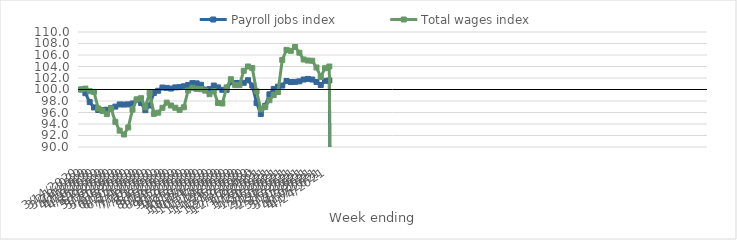
| Category | Payroll jobs index | Total wages index |
|---|---|---|
| 14/03/2020 | 100 | 100 |
| 21/03/2020 | 99.358 | 100.153 |
| 28/03/2020 | 97.811 | 99.701 |
| 04/04/2020 | 96.882 | 99.581 |
| 11/04/2020 | 96.433 | 96.708 |
| 18/04/2020 | 96.395 | 96.267 |
| 25/04/2020 | 96.489 | 95.714 |
| 02/05/2020 | 96.74 | 96.68 |
| 09/05/2020 | 97.022 | 94.374 |
| 16/05/2020 | 97.402 | 92.846 |
| 23/05/2020 | 97.386 | 92.178 |
| 30/05/2020 | 97.412 | 93.398 |
| 06/06/2020 | 97.56 | 96.486 |
| 13/06/2020 | 98.225 | 98.282 |
| 20/06/2020 | 97.658 | 98.485 |
| 27/06/2020 | 96.4 | 96.932 |
| 04/07/2020 | 97.215 | 99.382 |
| 11/07/2020 | 99.401 | 95.766 |
| 18/07/2020 | 99.781 | 95.965 |
| 25/07/2020 | 100.343 | 96.818 |
| 01/08/2020 | 100.273 | 97.715 |
| 08/08/2020 | 100.164 | 97.219 |
| 15/08/2020 | 100.369 | 96.834 |
| 22/08/2020 | 100.411 | 96.445 |
| 29/08/2020 | 100.557 | 96.905 |
| 05/09/2020 | 100.79 | 99.824 |
| 12/09/2020 | 101.112 | 100.296 |
| 19/09/2020 | 101.067 | 100.094 |
| 26/09/2020 | 100.821 | 100.059 |
| 03/10/2020 | 99.976 | 99.804 |
| 10/10/2020 | 100.066 | 99.185 |
| 17/10/2020 | 100.685 | 99.7 |
| 24/10/2020 | 100.366 | 97.655 |
| 31/10/2020 | 99.942 | 97.572 |
| 07/11/2020 | 99.945 | 100.366 |
| 14/11/2020 | 101.28 | 101.791 |
| 21/11/2020 | 101.136 | 100.757 |
| 28/11/2020 | 101.14 | 100.753 |
| 05/12/2020 | 101.17 | 103.259 |
| 12/12/2020 | 101.609 | 104.005 |
| 19/12/2020 | 100.681 | 103.721 |
| 26/12/2020 | 97.666 | 99.684 |
| 02/01/2021 | 95.747 | 96.559 |
| 09/01/2021 | 97.162 | 96.947 |
| 16/01/2021 | 99.164 | 98.135 |
| 23/01/2021 | 100.107 | 99.035 |
| 30/01/2021 | 100.498 | 99.564 |
| 06/02/2021 | 100.688 | 105.151 |
| 13/02/2021 | 101.49 | 106.892 |
| 20/02/2021 | 101.297 | 106.727 |
| 27/02/2021 | 101.328 | 107.391 |
| 06/03/2021 | 101.419 | 106.395 |
| 13/03/2021 | 101.733 | 105.22 |
| 20/03/2021 | 101.84 | 105.038 |
| 27/03/2021 | 101.732 | 104.999 |
| 03/04/2021 | 101.308 | 103.827 |
| 10/04/2021 | 100.783 | 102.196 |
| 17/04/2021 | 101.504 | 103.704 |
| 24/04/2021 | 101.573 | 103.998 |